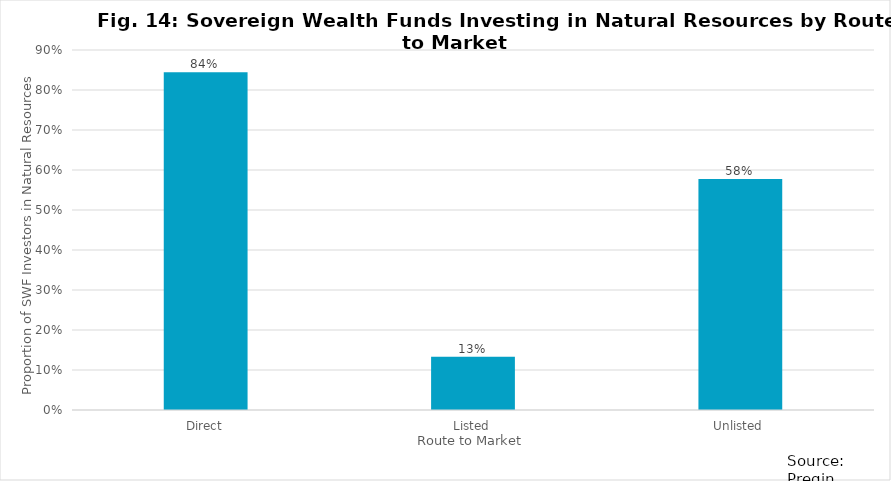
| Category | Series 0 |
|---|---|
| Direct | 0.844 |
| Listed | 0.133 |
| Unlisted | 0.578 |